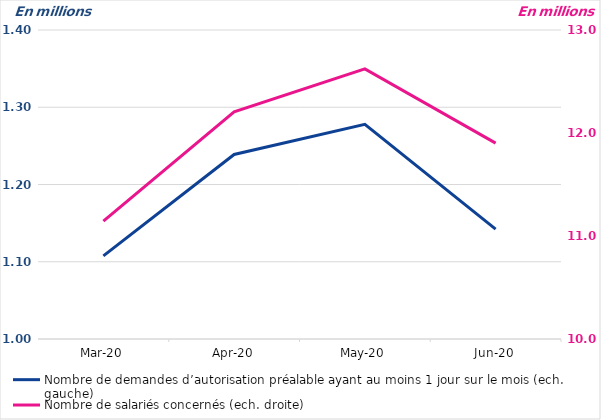
| Category | Nombre de demandes d’autorisation préalable ayant au moins 1 jour sur le mois (ech. gauche) |
|---|---|
| 2020-03-01 | 1.108 |
| 2020-04-01 | 1.239 |
| 2020-05-01 | 1.278 |
| 2020-06-01 | 1.142 |